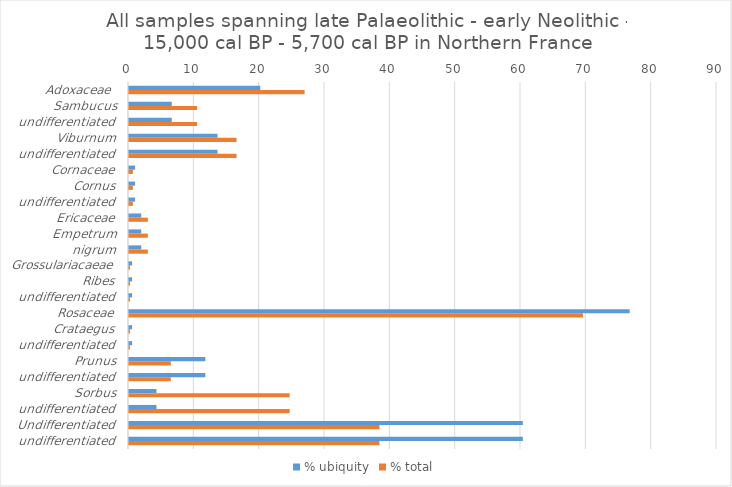
| Category | % ubiquity | % total |
|---|---|---|
| Adoxaceae  | 20.093 | 26.878 |
| Sambucus | 6.542 | 10.421 |
| undifferentiated | 6.542 | 10.421 |
| Viburnum | 13.551 | 16.458 |
| undifferentiated | 13.551 | 16.458 |
| Cornaceae | 0.935 | 0.589 |
| Cornus | 0.935 | 0.589 |
| undifferentiated | 0.935 | 0.589 |
| Ericaceae | 1.869 | 2.888 |
| Empetrum | 1.869 | 2.888 |
| nigrum | 1.869 | 2.888 |
| Grossulariacaeae | 0.467 | 0.16 |
| Ribes | 0.467 | 0.16 |
| undifferentiated | 0.467 | 0.16 |
| Rosaceae | 76.636 | 69.485 |
| Crataegus | 0.467 | 0.15 |
| undifferentiated | 0.467 | 0.15 |
| Prunus | 11.682 | 6.403 |
| undifferentiated | 11.682 | 6.403 |
| Sorbus | 4.206 | 24.593 |
| undifferentiated | 4.206 | 24.593 |
| Undifferentiated | 60.28 | 38.34 |
| undifferentiated | 60.28 | 38.34 |